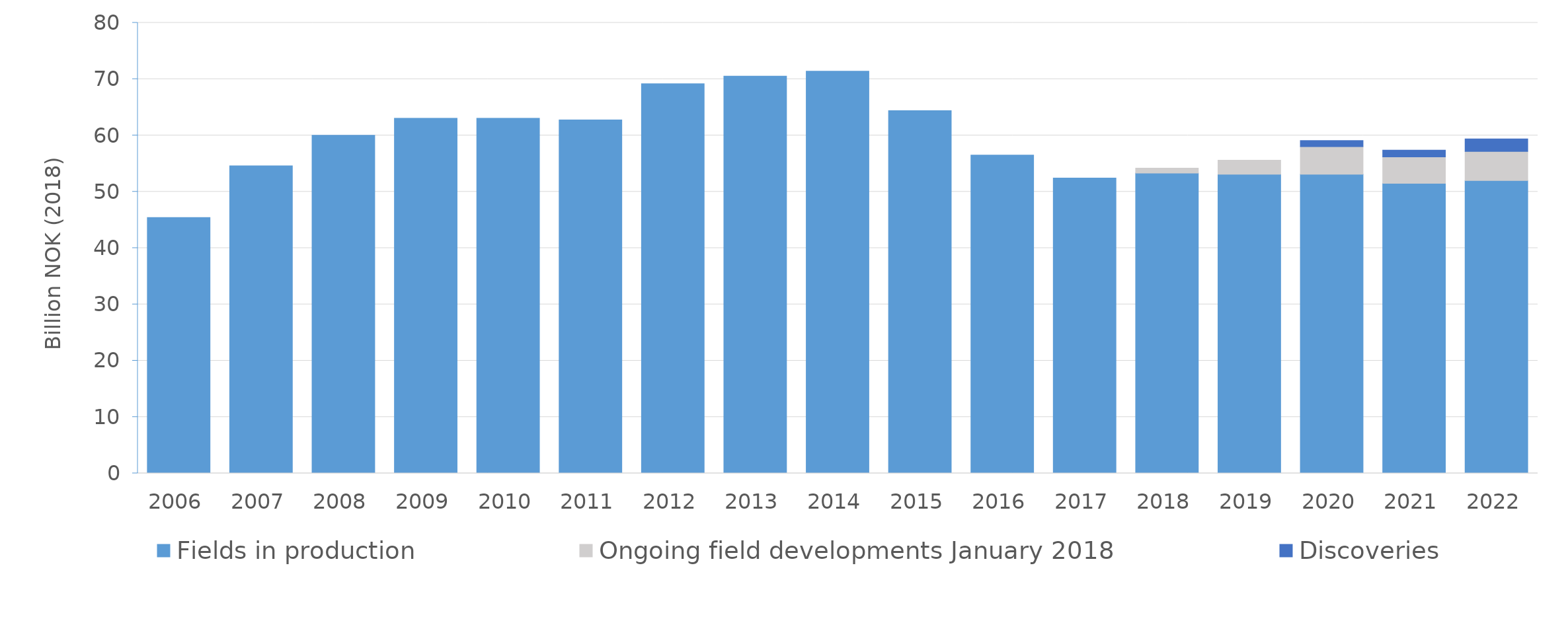
| Category | Fields in production | Ongoing field developments January 2018 | Discoveries |
|---|---|---|---|
| 2006.0 | 45.414 | 0 | 0 |
| 2007.0 | 54.606 | 0 | 0 |
| 2008.0 | 60.024 | 0 | 0 |
| 2009.0 | 63.036 | 0 | 0 |
| 2010.0 | 63.037 | 0 | 0 |
| 2011.0 | 62.763 | 0 | 0 |
| 2012.0 | 69.176 | 0 | 0 |
| 2013.0 | 70.523 | 0 | 0 |
| 2014.0 | 71.4 | 0 | 0 |
| 2015.0 | 64.39 | 0 | 0 |
| 2016.0 | 56.519 | 0 | 0 |
| 2017.0 | 52.448 | 0 | 0 |
| 2018.0 | 53.309 | 0.889 | 0 |
| 2019.0 | 53.105 | 2.49 | 0 |
| 2020.0 | 53.104 | 4.908 | 1.08 |
| 2021.0 | 51.482 | 4.714 | 1.207 |
| 2022.0 | 51.993 | 5.158 | 2.237 |